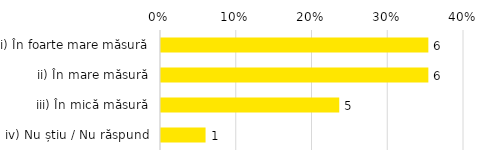
| Category | Total |
|---|---|
| i) În foarte mare măsură | 0.353 |
| ii) În mare măsură | 0.353 |
| iii) În mică măsură | 0.235 |
| iv) Nu știu / Nu răspund | 0.059 |